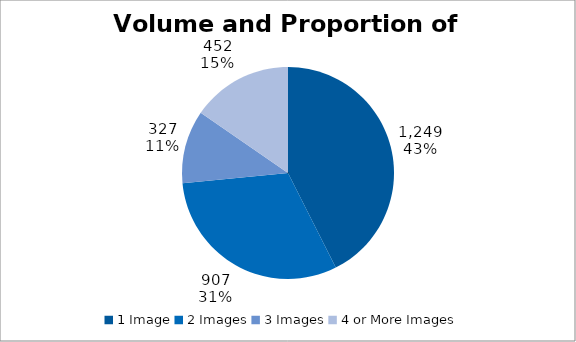
| Category | Total |
|---|---|
| 1 Image | 1249 |
| 2 Images | 907 |
| 3 Images | 327 |
| 4 or More Images | 452 |